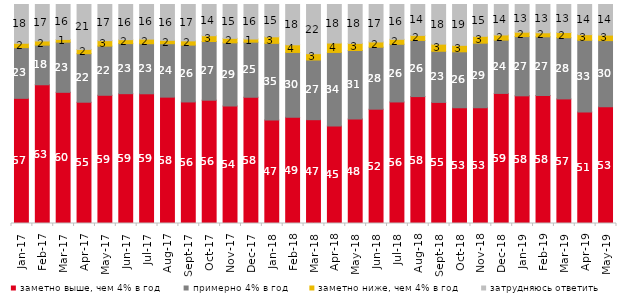
| Category | заметно выше, чем 4% в год | примерно 4% в год | заметно ниже, чем 4% в год | затрудняюсь ответить |
|---|---|---|---|---|
| 2017-01-01 | 57.15 | 23.15 | 2 | 17.7 |
| 2017-02-01 | 63.35 | 18.1 | 1.9 | 16.65 |
| 2017-03-01 | 59.9 | 22.9 | 1.25 | 15.95 |
| 2017-04-01 | 55.35 | 22.15 | 1.95 | 20.5 |
| 2017-05-01 | 58.55 | 22.45 | 2.5 | 16.5 |
| 2017-06-01 | 59.25 | 22.85 | 1.8 | 16.05 |
| 2017-07-01 | 59.2 | 22.85 | 2.1 | 15.8 |
| 2017-08-01 | 57.7 | 24.4 | 1.55 | 16.35 |
| 2017-09-01 | 55.5 | 25.95 | 1.95 | 16.6 |
| 2017-10-01 | 56.3 | 26.8 | 2.65 | 14.25 |
| 2017-11-01 | 53.6 | 28.9 | 2.05 | 15.45 |
| 2017-12-01 | 57.65 | 25.15 | 1.45 | 15.75 |
| 2018-01-01 | 47.25 | 35 | 3 | 14.75 |
| 2018-02-01 | 48.5 | 29.6 | 3.5 | 18.4 |
| 2018-03-01 | 47.4 | 27.25 | 2.9 | 22.45 |
| 2018-04-01 | 44.55 | 33.55 | 4.3 | 17.6 |
| 2018-05-01 | 47.7 | 31.3 | 3.25 | 17.75 |
| 2018-06-01 | 52.2 | 28.3 | 2.4 | 17.1 |
| 2018-07-01 | 55.5 | 26.35 | 2.25 | 15.9 |
| 2018-08-01 | 57.95 | 25.65 | 2.3 | 14.1 |
| 2018-09-01 | 55.3 | 23.35 | 3.25 | 18.1 |
| 2018-10-01 | 52.85 | 25.55 | 2.95 | 18.65 |
| 2018-11-01 | 52.844 | 29.491 | 3.144 | 14.521 |
| 2018-12-01 | 59.4 | 24.35 | 2.35 | 13.9 |
| 2019-01-01 | 58.3 | 27.05 | 2 | 12.65 |
| 2019-02-01 | 58.45 | 26.8 | 1.85 | 12.9 |
| 2019-03-01 | 56.887 | 27.946 | 2.387 | 12.78 |
| 2019-04-01 | 50.891 | 32.772 | 2.574 | 13.762 |
| 2019-05-01 | 53.343 | 30.163 | 2.526 | 13.967 |